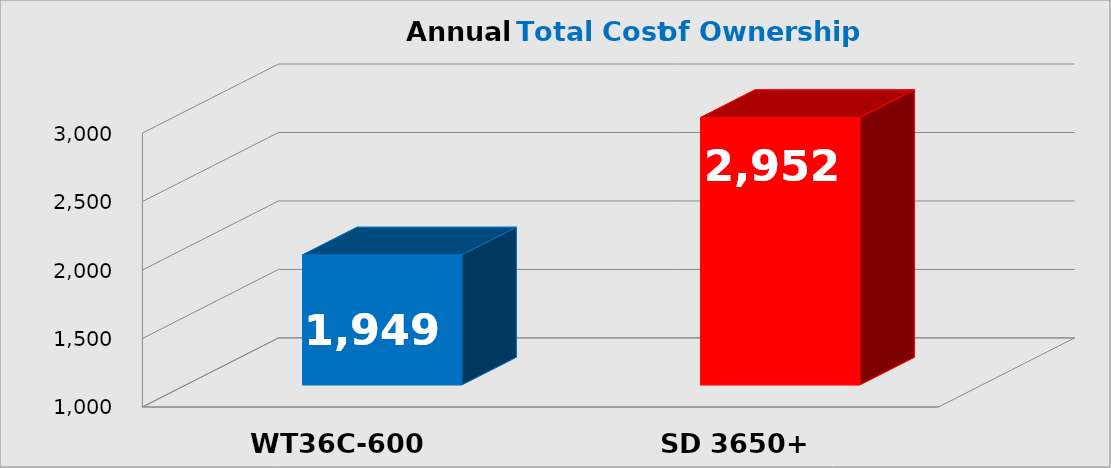
| Category | Series 0 |
|---|---|
| WT36C-600 | 1949 |
| SD 3650+ | 2952.34 |